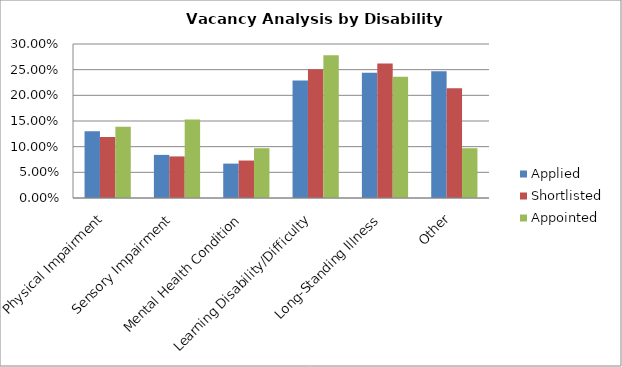
| Category | Applied | Shortlisted | Appointed |
|---|---|---|---|
| Physical Impairment | 0.13 | 0.119 | 0.139 |
| Sensory Impairment | 0.084 | 0.081 | 0.153 |
| Mental Health Condition | 0.067 | 0.073 | 0.097 |
| Learning Disability/Difficulty | 0.229 | 0.251 | 0.278 |
| Long-Standing Illness | 0.244 | 0.262 | 0.236 |
| Other | 0.247 | 0.214 | 0.097 |